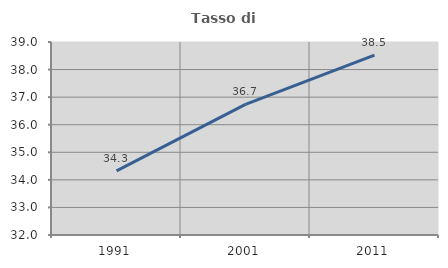
| Category | Tasso di occupazione   |
|---|---|
| 1991.0 | 34.323 |
| 2001.0 | 36.739 |
| 2011.0 | 38.527 |